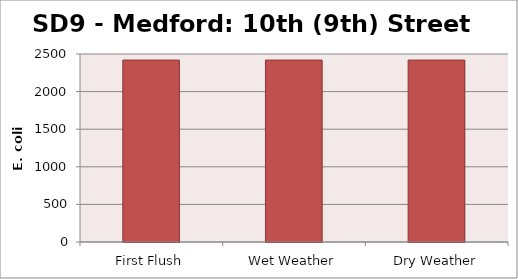
| Category | E. coli MPN |
|---|---|
| First Flush | 2419.2 |
| Wet Weather | 2419.2 |
| Dry Weather | 2419.2 |